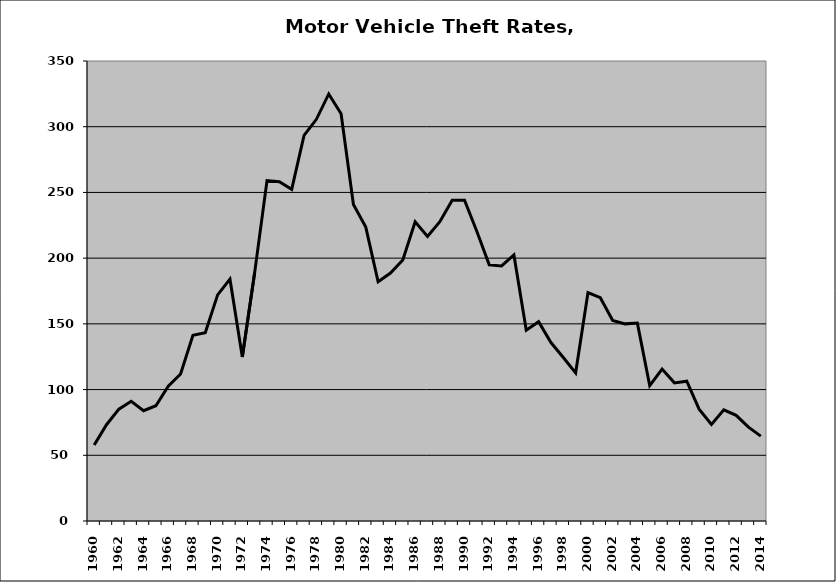
| Category | Motor Vehicle |
|---|---|
| 1960.0 | 57.833 |
| 1961.0 | 73.269 |
| 1962.0 | 85.127 |
| 1963.0 | 91.069 |
| 1964.0 | 83.945 |
| 1965.0 | 87.743 |
| 1966.0 | 102.496 |
| 1967.0 | 111.808 |
| 1968.0 | 141.311 |
| 1969.0 | 143.236 |
| 1970.0 | 172.026 |
| 1971.0 | 183.99 |
| 1972.0 | 124.773 |
| 1973.0 | 189.001 |
| 1974.0 | 259.035 |
| 1975.0 | 258.068 |
| 1976.0 | 252.311 |
| 1977.0 | 293.404 |
| 1978.0 | 305.626 |
| 1979.0 | 324.915 |
| 1980.0 | 309.864 |
| 1981.0 | 240.856 |
| 1982.0 | 223.659 |
| 1983.0 | 182.065 |
| 1984.0 | 188.639 |
| 1985.0 | 198.597 |
| 1986.0 | 227.653 |
| 1987.0 | 216.462 |
| 1988.0 | 227.712 |
| 1989.0 | 243.993 |
| 1990.0 | 244.038 |
| 1991.0 | 220.271 |
| 1992.0 | 194.869 |
| 1993.0 | 194.044 |
| 1994.0 | 202.463 |
| 1995.0 | 145.122 |
| 1996.0 | 151.635 |
| 1997.0 | 135.806 |
| 1998.0 | 124.388 |
| 1999.0 | 112.727 |
| 2000.0 | 173.817 |
| 2001.0 | 169.928 |
| 2002.0 | 152.542 |
| 2003.0 | 149.996 |
| 2004.0 | 150.558 |
| 2005.0 | 102.998 |
| 2006.0 | 115.599 |
| 2007.0 | 105.105 |
| 2008.0 | 106.364 |
| 2009.0 | 85.084 |
| 2010.0 | 73.53 |
| 2011.0 | 84.534 |
| 2012.0 | 80.356 |
| 2013.0 | 71.374 |
| 2014.0 | 64.591 |